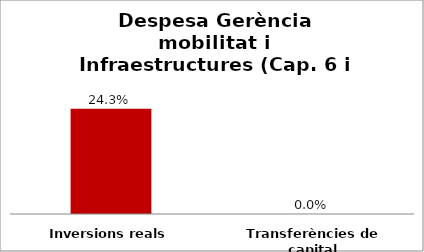
| Category | Series 0 |
|---|---|
| Inversions reals | 0.243 |
| Transferències de capital | 0 |